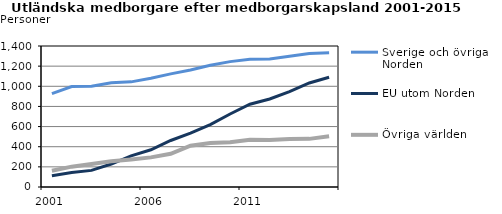
| Category | Sverige och övriga Norden | EU utom Norden | Övriga världen |
|---|---|---|---|
| 2001 | 927 | 112 | 162 |
| 2002 | 997 | 145 | 202 |
| 2003 | 1001 | 165 | 229 |
| 2004 | 1036 | 228 | 256 |
| 2005 | 1044 | 309 | 274 |
| 2006 | 1079 | 370 | 294 |
| 2007 | 1123 | 462 | 330 |
| 2008 | 1161 | 535 | 410 |
| 2009 | 1209 | 620 | 436 |
| 2010 | 1245 | 725 | 445 |
| 2011 | 1268 | 822 | 470 |
| 2012 | 1270 | 874 | 466 |
| 2013 | 1298 | 946 | 477 |
| 2014 | 1326 | 1033 | 478 |
| 2015 | 1333 | 1090 | 504 |